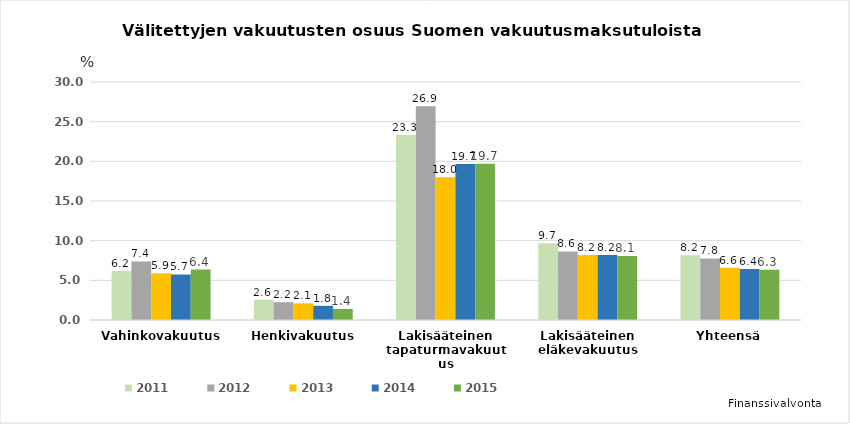
| Category | 2011 | 2012 | 2013 | 2014 | 2015 |
|---|---|---|---|---|---|
| Vahinkovakuutus | 6.168 | 7.375 | 5.882 | 5.737 | 6.356 |
| Henkivakuutus | 2.56 | 2.246 | 2.097 | 1.791 | 1.39 |
| Lakisääteinen tapaturmavakuutus | 23.324 | 26.944 | 17.98 | 19.654 | 19.692 |
| Lakisääteinen eläkevakuutus | 9.661 | 8.637 | 8.204 | 8.203 | 8.075 |
| Yhteensä | 8.167 | 7.754 | 6.584 | 6.436 | 6.337 |